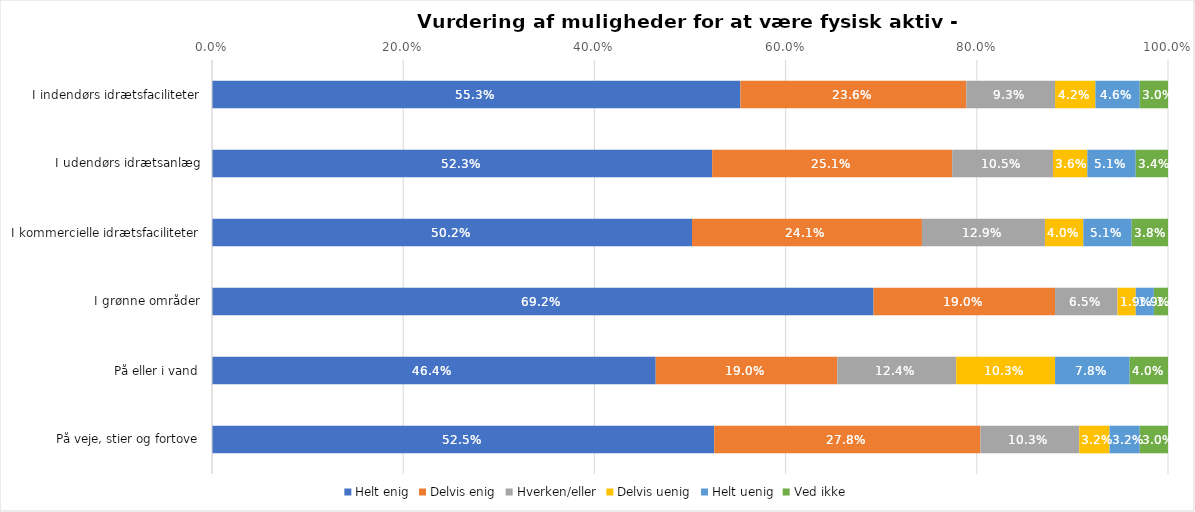
| Category | Helt enig | Delvis enig | Hverken/eller | Delvis uenig | Helt uenig | Ved ikke |
|---|---|---|---|---|---|---|
| I indendørs idrætsfaciliteter | 0.553 | 0.236 | 0.093 | 0.042 | 0.046 | 0.03 |
| I udendørs idrætsanlæg | 0.523 | 0.251 | 0.105 | 0.036 | 0.051 | 0.034 |
| I kommercielle idrætsfaciliteter | 0.502 | 0.241 | 0.129 | 0.04 | 0.051 | 0.038 |
| I grønne områder | 0.692 | 0.19 | 0.065 | 0.019 | 0.019 | 0.015 |
| På eller i vand | 0.464 | 0.19 | 0.124 | 0.103 | 0.078 | 0.04 |
| På veje, stier og fortove | 0.525 | 0.278 | 0.103 | 0.032 | 0.032 | 0.03 |